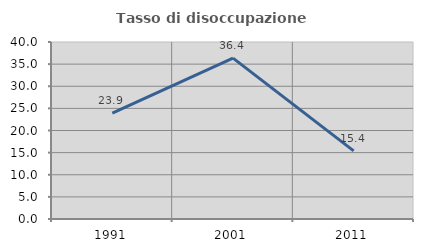
| Category | Tasso di disoccupazione giovanile  |
|---|---|
| 1991.0 | 23.913 |
| 2001.0 | 36.364 |
| 2011.0 | 15.385 |